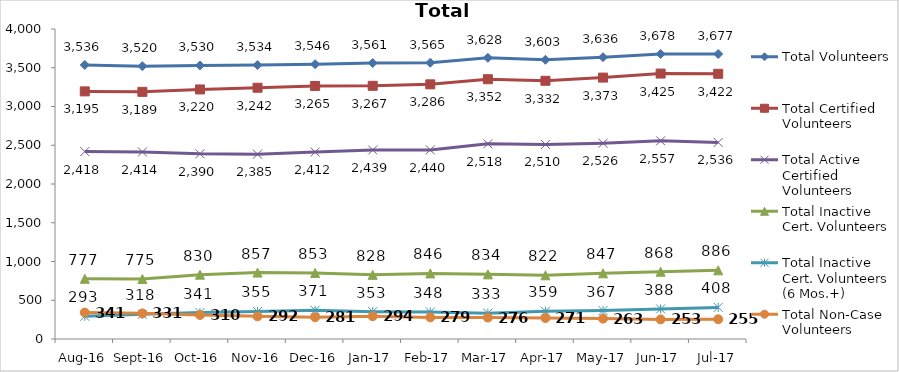
| Category | Total Volunteers | Total Certified Volunteers | Total Active Certified Volunteers | Total Inactive Cert. Volunteers | Total Inactive Cert. Volunteers (6 Mos.+) | Total Non-Case Volunteers |
|---|---|---|---|---|---|---|
| Aug-16 | 3536 | 3195 | 2418 | 777 | 293 | 341 |
| Sep-16 | 3520 | 3189 | 2414 | 775 | 318 | 331 |
| Oct-16 | 3530 | 3220 | 2390 | 830 | 341 | 310 |
| Nov-16 | 3534 | 3242 | 2385 | 857 | 355 | 292 |
| Dec-16 | 3546 | 3265 | 2412 | 853 | 371 | 281 |
| Jan-17 | 3561 | 3267 | 2439 | 828 | 353 | 294 |
| Feb-17 | 3565 | 3286 | 2440 | 846 | 348 | 279 |
| Mar-17 | 3628 | 3352 | 2518 | 834 | 333 | 276 |
| Apr-17 | 3603 | 3332 | 2510 | 822 | 359 | 271 |
| May-17 | 3636 | 3373 | 2526 | 847 | 367 | 263 |
| Jun-17 | 3678 | 3425 | 2557 | 868 | 388 | 253 |
| Jul-17 | 3677 | 3422 | 2536 | 886 | 408 | 255 |